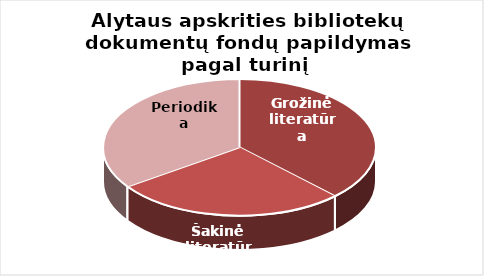
| Category | Series 0 |
|---|---|
| Grožinė literatūra | 18250 |
| Šakinė literatūra | 13372 |
| Periodika | 16799 |